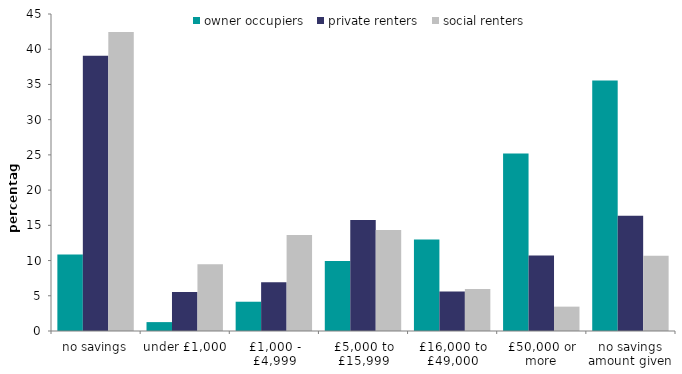
| Category | owner occupiers | private renters | social renters |
|---|---|---|---|
| no savings | 10.872 | 39.071 | 42.441 |
| under £1,000 | 1.262 | 5.539 | 9.462 |
| £1,000 - £4,999 | 4.155 | 6.935 | 13.645 |
| £5,000 to £15,999 | 9.942 | 15.762 | 14.345 |
| £16,000 to £49,000 | 13.004 | 5.619 | 5.953 |
| £50,000 or more | 25.208 | 10.705 | 3.458 |
| no savings amount given | 35.558 | 16.369 | 10.697 |